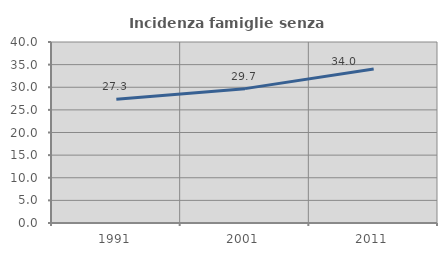
| Category | Incidenza famiglie senza nuclei |
|---|---|
| 1991.0 | 27.322 |
| 2001.0 | 29.693 |
| 2011.0 | 34.041 |